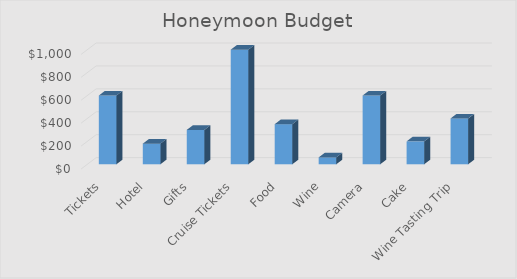
| Category | Total cost |
|---|---|
| Tickets | 600 |
| Hotel | 180 |
| Gifts | 300 |
| Cruise Tickets | 1000 |
| Food | 350 |
| Wine | 60 |
| Camera | 600 |
| Cake | 200 |
| Wine Tasting Trip | 400 |